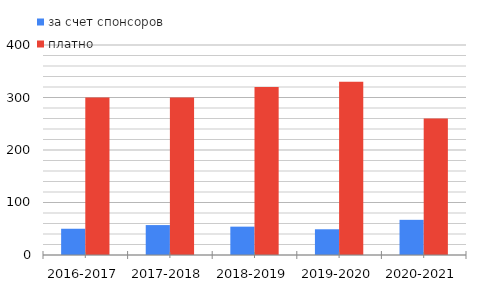
| Category | за счет спонсоров | платно |
|---|---|---|
| 2016-2017 | 50 | 300 |
| 2017-2018 | 57 | 300 |
| 2018-2019 | 54 | 320 |
| 2019-2020 | 49 | 330 |
| 2020-2021 | 67 | 260 |